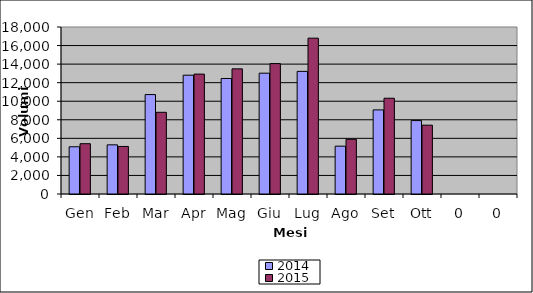
| Category | 2014 | 2015 |
|---|---|---|
| Gen | 5090 | 5421 |
| Feb | 5299 | 5126 |
| Mar | 10717 | 8805 |
| Apr | 12805 | 12923 |
| Mag | 12450 | 13488 |
| Giu | 13022 | 14056 |
| Lug | 13218 | 16796 |
| Ago | 5156 | 5896 |
| Set | 9064 | 10322 |
| Ott | 7914 | 7417 |
| 0 | 0 | 0 |
| 0 | 0 | 0 |